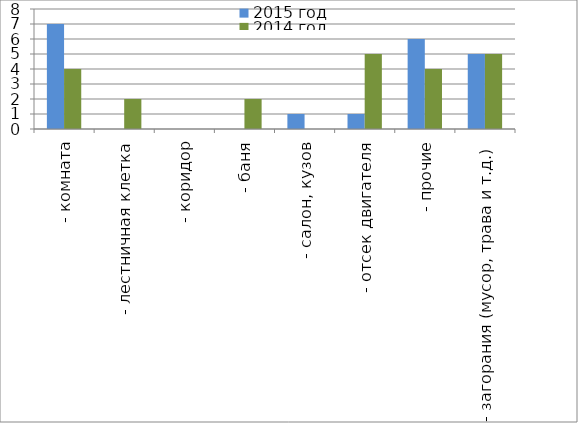
| Category | 2015 год | 2014 год |
|---|---|---|
|  - комната | 7 | 4 |
|  - лестничная клетка | 0 | 2 |
|  - коридор | 0 | 0 |
|  - баня | 0 | 2 |
|  - салон, кузов | 1 | 0 |
|  - отсек двигателя | 1 | 5 |
| - прочие | 6 | 4 |
| - загорания (мусор, трава и т.д.)  | 5 | 5 |